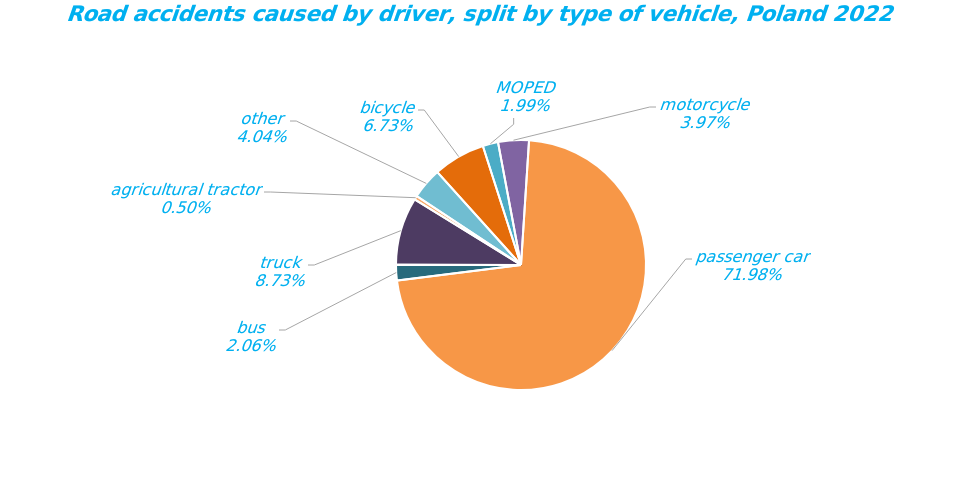
| Category | Series 0 |
|---|---|
| bicycle | 1304 |
| MOPED | 385 |
| motorcycle | 770 |
| passenger car | 13945 |
| bus | 399 |
| truck | 1691 |
| agricultural tractor | 97 |
| other | 782 |